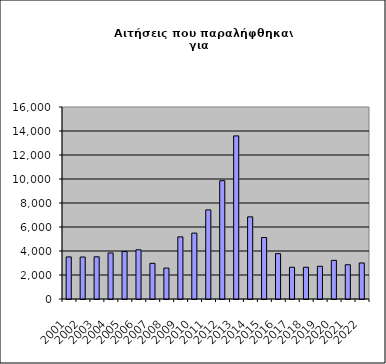
| Category | Series 0 |
|---|---|
| 2001.0 | 3505 |
| 2002.0 | 3497 |
| 2003.0 | 3516 |
| 2004.0 | 3838 |
| 2005.0 | 3956 |
| 2006.0 | 4101 |
| 2007.0 | 2972 |
| 2008.0 | 2577 |
| 2009.0 | 5177 |
| 2010.0 | 5491 |
| 2011.0 | 7426 |
| 2012.0 | 9860 |
| 2013.0 | 13592 |
| 2014.0 | 6846 |
| 2015.0 | 5123 |
| 2016.0 | 3779 |
| 2017.0 | 2647 |
| 2018.0 | 2647 |
| 2019.0 | 2729 |
| 2020.0 | 3222 |
| 2021.0 | 2855 |
| 2022.0 | 3002 |